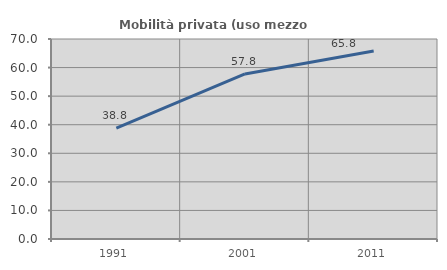
| Category | Mobilità privata (uso mezzo privato) |
|---|---|
| 1991.0 | 38.831 |
| 2001.0 | 57.776 |
| 2011.0 | 65.819 |